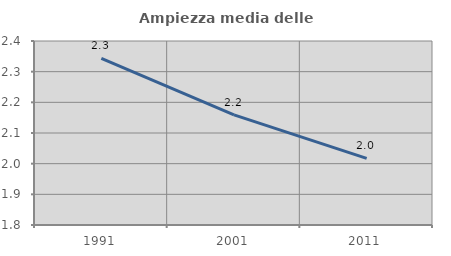
| Category | Ampiezza media delle famiglie |
|---|---|
| 1991.0 | 2.343 |
| 2001.0 | 2.159 |
| 2011.0 | 2.017 |